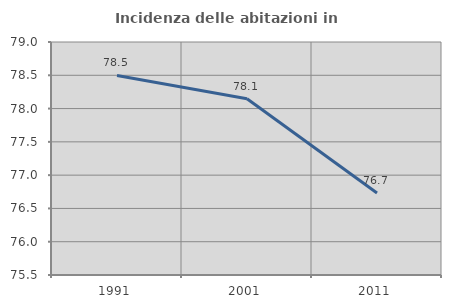
| Category | Incidenza delle abitazioni in proprietà  |
|---|---|
| 1991.0 | 78.497 |
| 2001.0 | 78.148 |
| 2011.0 | 76.732 |